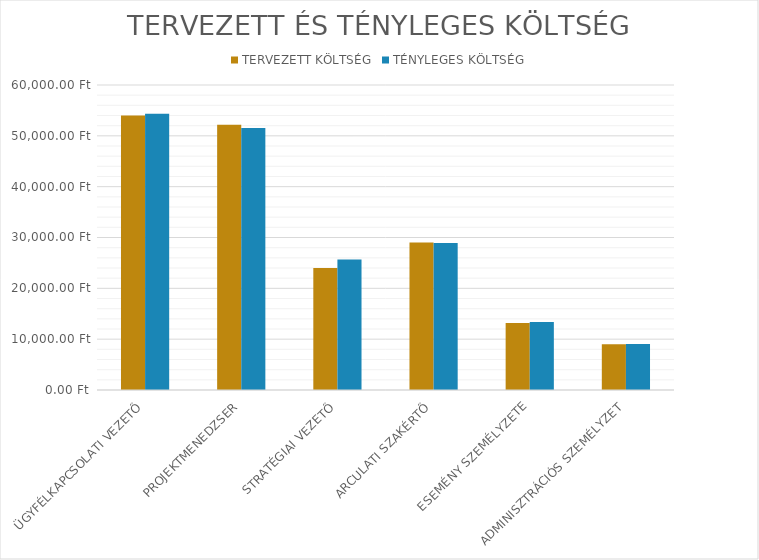
| Category | TERVEZETT KÖLTSÉG | TÉNYLEGES KÖLTSÉG |
|---|---|---|
| ÜGYFÉLKAPCSOLATI VEZETŐ | 54000 | 54360 |
| PROJEKTMENEDZSER | 52200 | 51540 |
| STRATÉGIAI VEZETŐ | 24000 | 25650 |
| ARCULATI SZAKÉRTŐ | 29000 | 28900 |
| ESEMÉNY SZEMÉLYZETE | 13200 | 13400 |
| ADMINISZTRÁCIÓS SZEMÉLYZET | 9000 | 9060 |